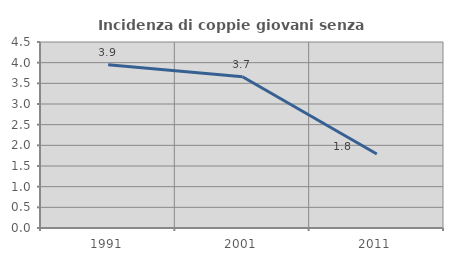
| Category | Incidenza di coppie giovani senza figli |
|---|---|
| 1991.0 | 3.947 |
| 2001.0 | 3.659 |
| 2011.0 | 1.792 |